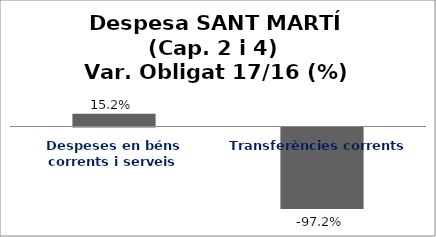
| Category | Series 0 |
|---|---|
| Despeses en béns corrents i serveis | 0.152 |
| Transferències corrents | -0.972 |